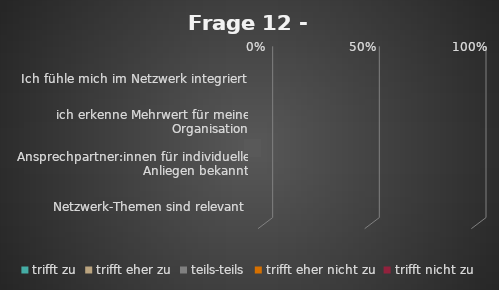
| Category | trifft zu | trifft eher zu | teils-teils | trifft eher nicht zu | trifft nicht zu |
|---|---|---|---|---|---|
| Ich fühle mich im Netzwerk integriert | 0 | 0 | 0 | 0 | 0 |
| ich erkenne Mehrwert für meine Organisation | 0 | 0 | 0 | 0 | 0 |
| Ansprechpartner:innen für individuelle Anliegen bekannt | 0 | 0 | 0 | 0 | 0 |
| Netzwerk-Themen sind relevant | 0 | 0 | 0 | 0 | 0 |